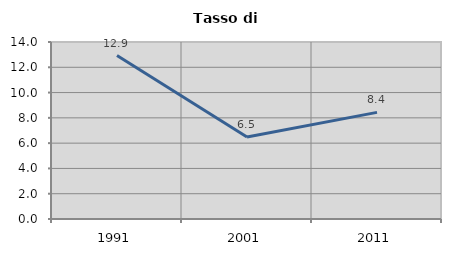
| Category | Tasso di disoccupazione   |
|---|---|
| 1991.0 | 12.93 |
| 2001.0 | 6.482 |
| 2011.0 | 8.432 |